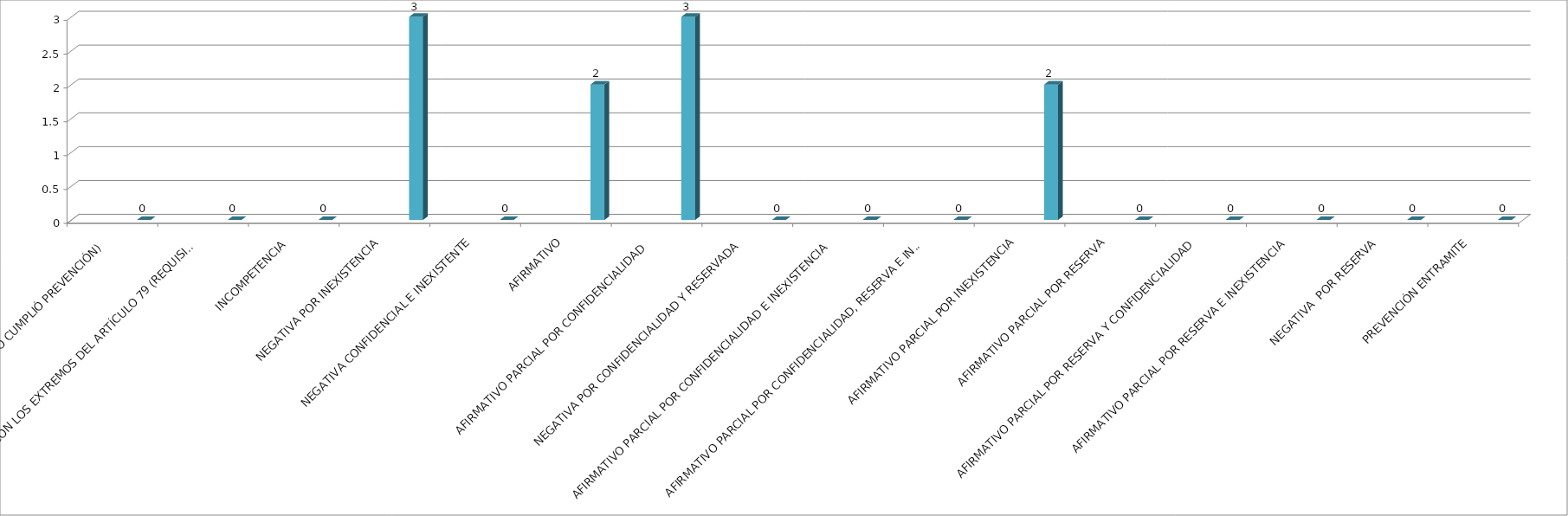
| Category | Series 0 | Series 1 | Series 2 | Series 3 | Series 4 |
|---|---|---|---|---|---|
| SE TIENE POR NO PRESENTADA ( NO CUMPLIÓ PREVENCIÓN) |  |  |  |  | 0 |
| NO CUMPLIO CON LOS EXTREMOS DEL ARTÍCULO 79 (REQUISITOS) |  |  |  |  | 0 |
| INCOMPETENCIA  |  |  |  |  | 0 |
| NEGATIVA POR INEXISTENCIA |  |  |  |  | 3 |
| NEGATIVA CONFIDENCIAL E INEXISTENTE |  |  |  |  | 0 |
| AFIRMATIVO |  |  |  |  | 2 |
| AFIRMATIVO PARCIAL POR CONFIDENCIALIDAD  |  |  |  |  | 3 |
| NEGATIVA POR CONFIDENCIALIDAD Y RESERVADA |  |  |  |  | 0 |
| AFIRMATIVO PARCIAL POR CONFIDENCIALIDAD E INEXISTENCIA |  |  |  |  | 0 |
| AFIRMATIVO PARCIAL POR CONFIDENCIALIDAD, RESERVA E INEXISTENCIA |  |  |  |  | 0 |
| AFIRMATIVO PARCIAL POR INEXISTENCIA |  |  |  |  | 2 |
| AFIRMATIVO PARCIAL POR RESERVA |  |  |  |  | 0 |
| AFIRMATIVO PARCIAL POR RESERVA Y CONFIDENCIALIDAD |  |  |  |  | 0 |
| AFIRMATIVO PARCIAL POR RESERVA E INEXISTENCIA |  |  |  |  | 0 |
| NEGATIVA  POR RESERVA |  |  |  |  | 0 |
| PREVENCIÓN ENTRAMITE |  |  |  |  | 0 |